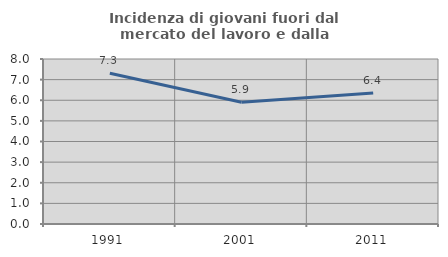
| Category | Incidenza di giovani fuori dal mercato del lavoro e dalla formazione  |
|---|---|
| 1991.0 | 7.309 |
| 2001.0 | 5.902 |
| 2011.0 | 6.355 |